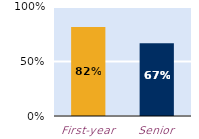
| Category | frequently |
|---|---|
| First-year | 0.817 |
| Senior | 0.669 |